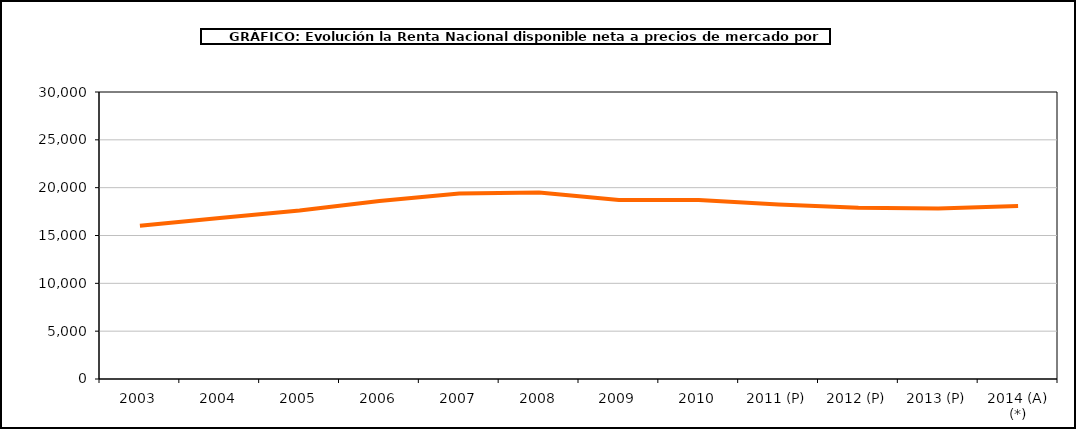
| Category | Renta por habitante |
|---|---|
| 2003 | 16030.413 |
| 2004 | 16821.604 |
| 2005 | 17616.696 |
| 2006 | 18603.095 |
| 2007 | 19401.051 |
| 2008 | 19491.849 |
| 2009 | 18719.406 |
| 2010 | 18706.369 |
| 2011 (P) | 18228.845 |
| 2012 (P) | 17896.031 |
| 2013 (P) | 17812.757 |
| 2014 (A) (*) | 18075.035 |